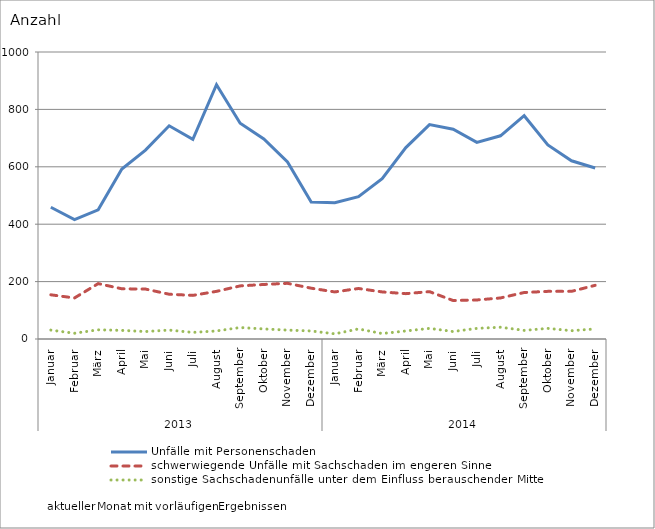
| Category | Unfälle mit Personenschaden | schwerwiegende Unfälle mit Sachschaden im engeren Sinne | sonstige Sachschadenunfälle unter dem Einfluss berauschender Mittel |
|---|---|---|---|
| 0 | 459 | 154 | 31 |
| 1 | 416 | 143 | 20 |
| 2 | 450 | 193 | 32 |
| 3 | 592 | 175 | 30 |
| 4 | 658 | 174 | 26 |
| 5 | 743 | 156 | 31 |
| 6 | 696 | 152 | 23 |
| 7 | 886 | 166 | 28 |
| 8 | 752 | 185 | 40 |
| 9 | 697 | 190 | 35 |
| 10 | 617 | 194 | 31 |
| 11 | 477 | 177 | 28 |
| 12 | 475 | 164 | 18 |
| 13 | 496 | 176 | 35 |
| 14 | 559 | 164 | 19 |
| 15 | 667 | 158 | 28 |
| 16 | 747 | 165 | 37 |
| 17 | 731 | 134 | 26 |
| 18 | 685 | 136 | 37 |
| 19 | 708 | 143 | 41 |
| 20 | 778 | 162 | 30 |
| 21 | 676 | 166 | 37 |
| 22 | 621 | 166 | 29 |
| 23 | 596 | 187 | 35 |